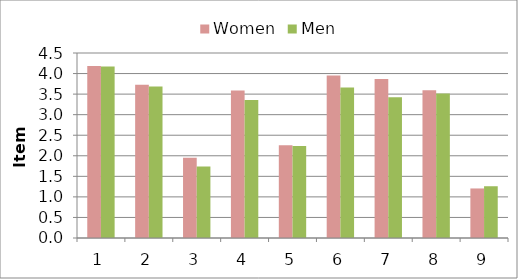
| Category | Women | Men |
|---|---|---|
| 0 | 4.184 | 4.171 |
| 1 | 3.725 | 3.685 |
| 2 | 1.952 | 1.739 |
| 3 | 3.589 | 3.357 |
| 4 | 2.256 | 2.235 |
| 5 | 3.955 | 3.661 |
| 6 | 3.869 | 3.421 |
| 7 | 3.595 | 3.517 |
| 8 | 1.205 | 1.259 |